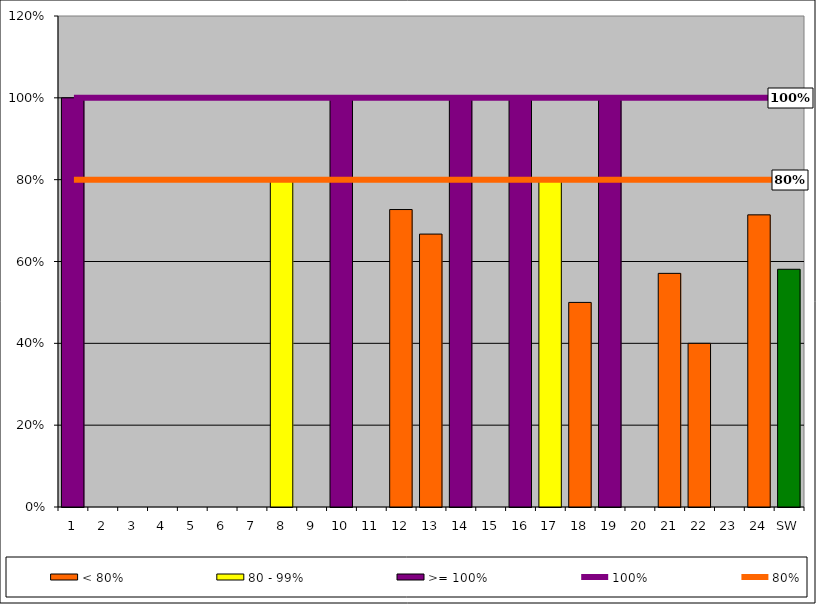
| Category | < 80% | 80 - 99% | >= 100% |
|---|---|---|---|
| 1 | 0 | 0 | 1 |
| 2 | 0 | 0 | 0 |
| 3 | 0 | 0 | 0 |
| 4 | 0 | 0 | 0 |
| 5 | 0 | 0 | 0 |
| 6 | 0 | 0 | 0 |
| 7 | 0 | 0 | 0 |
| 8 | 0 | 0.8 | 0 |
| 9 | 0 | 0 | 0 |
| 10 | 0 | 0 | 1 |
| 11 | 0 | 0 | 0 |
| 12 | 0.727 | 0 | 0 |
| 13 | 0.667 | 0 | 0 |
| 14 | 0 | 0 | 1 |
| 15 | 0 | 0 | 0 |
| 16 | 0 | 0 | 1 |
| 17 | 0 | 0.8 | 0 |
| 18 | 0.5 | 0 | 0 |
| 19 | 0 | 0 | 1 |
| 20 | 0 | 0 | 0 |
| 21 | 0.571 | 0 | 0 |
| 22 | 0.4 | 0 | 0 |
| 23 | 0 | 0 | 0 |
| 24 | 0.714 | 0 | 0 |
| SW | 0.581 | 0 | 0 |